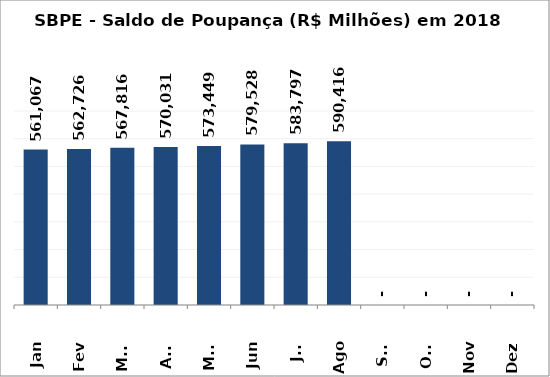
| Category | SBPE - Saldo de Poupança (R$ Milhões) em 2018 |
|---|---|
| Jan | 561067.029 |
| Fev | 562726.35 |
| Mar | 567815.814 |
| Abr | 570031.124 |
| Mai | 573448.941 |
| Jun | 579528.234 |
| Jul | 583797.2 |
| Ago | 590415.66 |
| Set | 0 |
| Out | 0 |
| Nov | 0 |
| Dez | 0 |